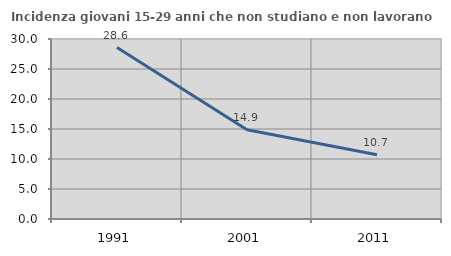
| Category | Incidenza giovani 15-29 anni che non studiano e non lavorano  |
|---|---|
| 1991.0 | 28.571 |
| 2001.0 | 14.865 |
| 2011.0 | 10.714 |